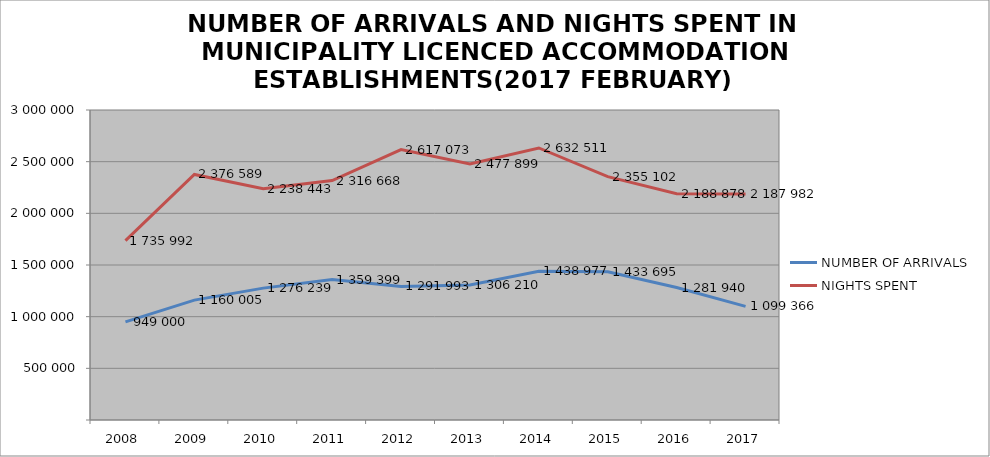
| Category | NUMBER OF ARRIVALS | NIGHTS SPENT |
|---|---|---|
| 2008 | 949000 | 1735992 |
| 2009 | 1160005 | 2376589 |
| 2010 | 1276239 | 2238443 |
| 2011 | 1359399 | 2316668 |
| 2012 | 1291993 | 2617073 |
| 2013 | 1306210 | 2477899 |
| 2014 | 1438977 | 2632511 |
| 2015 | 1433695 | 2355102 |
| 2016 | 1281940 | 2188878 |
| 2017 | 1099366 | 2187982 |